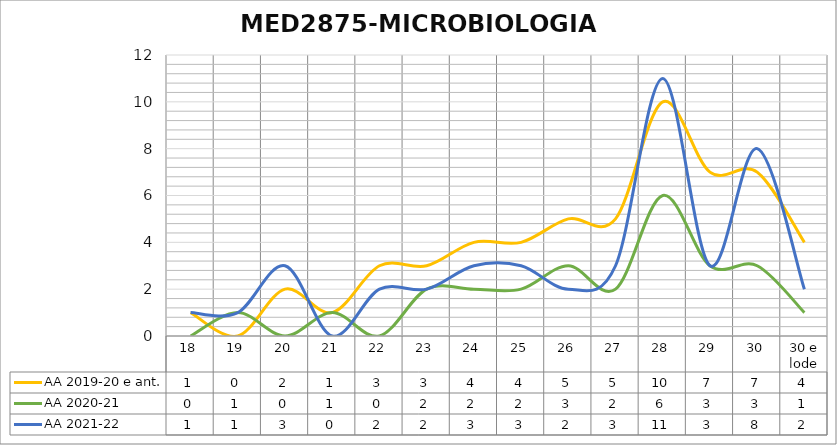
| Category | AA 2019-20 e ant. | AA 2020-21 | AA 2021-22 |
|---|---|---|---|
| 18 | 1 | 0 | 1 |
| 19 | 0 | 1 | 1 |
| 20 | 2 | 0 | 3 |
| 21 | 1 | 1 | 0 |
| 22 | 3 | 0 | 2 |
| 23 | 3 | 2 | 2 |
| 24 | 4 | 2 | 3 |
| 25 | 4 | 2 | 3 |
| 26 | 5 | 3 | 2 |
| 27 | 5 | 2 | 3 |
| 28 | 10 | 6 | 11 |
| 29 | 7 | 3 | 3 |
| 30 | 7 | 3 | 8 |
| 30 e lode | 4 | 1 | 2 |